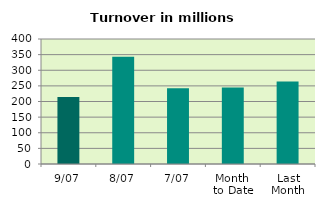
| Category | Series 0 |
|---|---|
| 9/07 | 214.355 |
| 8/07 | 343.598 |
| 7/07 | 242.485 |
| Month 
to Date | 244.485 |
| Last
Month | 264.074 |